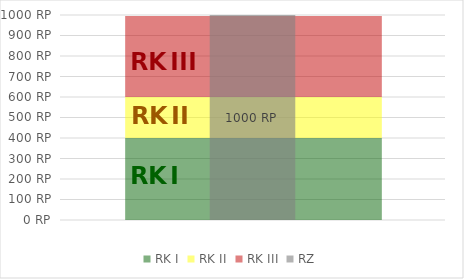
| Category | RZ |
|---|---|
| 0 | 0 |
| 1 | 1000 |
| 2 | 0 |